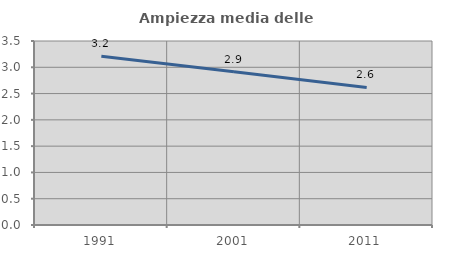
| Category | Ampiezza media delle famiglie |
|---|---|
| 1991.0 | 3.212 |
| 2001.0 | 2.916 |
| 2011.0 | 2.616 |